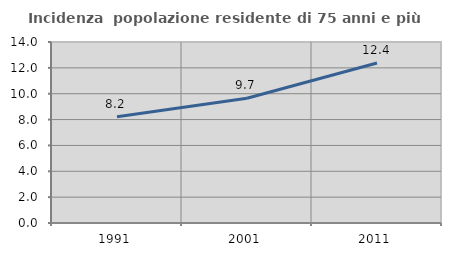
| Category | Incidenza  popolazione residente di 75 anni e più |
|---|---|
| 1991.0 | 8.217 |
| 2001.0 | 9.65 |
| 2011.0 | 12.371 |